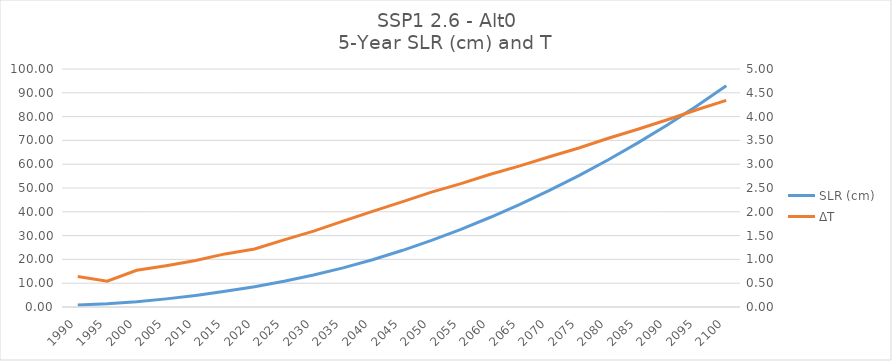
| Category | SLR (cm) |
|---|---|
| 1990.0 | 0.851 |
| 1995.0 | 1.315 |
| 2000.0 | 2.215 |
| 2005.0 | 3.412 |
| 2010.0 | 4.865 |
| 2015.0 | 6.592 |
| 2020.0 | 8.518 |
| 2025.0 | 10.794 |
| 2030.0 | 13.413 |
| 2035.0 | 16.439 |
| 2040.0 | 19.875 |
| 2045.0 | 23.72 |
| 2050.0 | 27.995 |
| 2055.0 | 32.643 |
| 2060.0 | 37.705 |
| 2065.0 | 43.136 |
| 2070.0 | 48.976 |
| 2075.0 | 55.206 |
| 2080.0 | 61.884 |
| 2085.0 | 68.971 |
| 2090.0 | 76.499 |
| 2095.0 | 84.496 |
| 2100.0 | 92.929 |